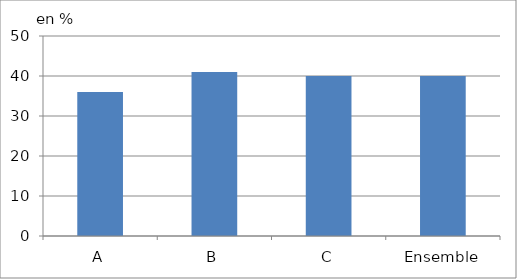
| Category | Series 0 |
|---|---|
| A | 36 |
| B | 41 |
| C | 40 |
| Ensemble | 40 |